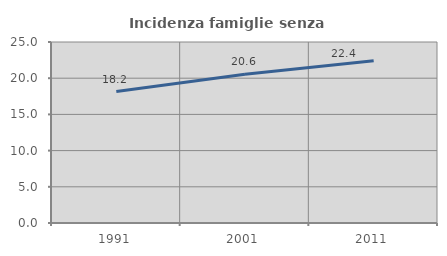
| Category | Incidenza famiglie senza nuclei |
|---|---|
| 1991.0 | 18.159 |
| 2001.0 | 20.557 |
| 2011.0 | 22.415 |